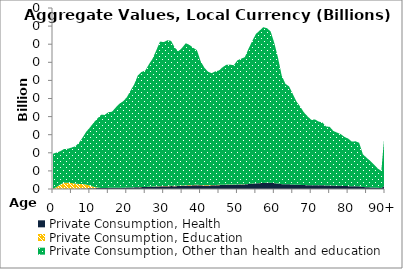
| Category | Private Consumption, Health | Private Consumption, Education | Private Consumption, Other than health and education |
|---|---|---|---|
| 0 | 0.013 | 0 | 3.884 |
|  | 0.017 | 0.215 | 3.801 |
| 2 | 0.019 | 0.484 | 3.68 |
| 3 | 0.022 | 0.674 | 3.724 |
| 4 | 0.024 | 0.67 | 3.746 |
| 5 | 0.028 | 0.629 | 3.917 |
| 6 | 0.033 | 0.568 | 4.117 |
| 7 | 0.041 | 0.52 | 4.518 |
| 8 | 0.051 | 0.506 | 5.117 |
| 9 | 0.064 | 0.427 | 5.83 |
| 10 | 0.075 | 0.305 | 6.408 |
| 11 | 0.088 | 0.153 | 7.078 |
| 12 | 0.1 | 0.065 | 7.606 |
| 13 | 0.112 | 0.003 | 8.084 |
| 14 | 0.116 | 0.001 | 8.07 |
| 15 | 0.123 | 0.002 | 8.356 |
| 16 | 0.126 | 0 | 8.415 |
| 17 | 0.134 | 0 | 8.868 |
| 18 | 0.141 | 0 | 9.277 |
| 19 | 0.146 | 0.001 | 9.542 |
| 20 | 0.153 | 0.002 | 9.97 |
| 21 | 0.166 | 0.003 | 10.688 |
| 22 | 0.179 | 0.005 | 11.363 |
| 23 | 0.197 | 0.007 | 12.351 |
| 24 | 0.207 | 0.009 | 12.719 |
| 25 | 0.213 | 0.011 | 12.854 |
| 26 | 0.23 | 0.014 | 13.53 |
| 27 | 0.246 | 0.018 | 14.136 |
| 28 | 0.268 | 0.022 | 15.039 |
| 29 | 0.291 | 0.026 | 15.972 |
| 30 | 0.297 | 0.029 | 15.905 |
| 31 | 0.31 | 0.032 | 16.09 |
| 32 | 0.319 | 0.035 | 16.023 |
| 33 | 0.315 | 0.036 | 15.281 |
| 34 | 0.319 | 0.037 | 14.86 |
| 35 | 0.343 | 0.041 | 15.226 |
| 36 | 0.374 | 0.044 | 15.688 |
| 37 | 0.391 | 0.046 | 15.486 |
| 38 | 0.406 | 0.046 | 15.152 |
| 39 | 0.42 | 0.047 | 14.881 |
| 40 | 0.403 | 0.043 | 13.694 |
| 41 | 0.397 | 0.041 | 12.988 |
| 42 | 0.396 | 0.038 | 12.534 |
| 43 | 0.401 | 0.037 | 12.363 |
| 44 | 0.415 | 0.035 | 12.544 |
| 45 | 0.425 | 0.033 | 12.642 |
| 46 | 0.442 | 0.032 | 12.99 |
| 47 | 0.456 | 0.03 | 13.241 |
| 48 | 0.461 | 0.027 | 13.256 |
| 49 | 0.464 | 0.023 | 13.184 |
| 50 | 0.488 | 0.021 | 13.712 |
| 51 | 0.499 | 0.018 | 13.878 |
| 52 | 0.509 | 0.015 | 14.041 |
| 53 | 0.547 | 0.013 | 14.932 |
| 54 | 0.584 | 0.012 | 15.752 |
| 55 | 0.62 | 0.01 | 16.498 |
| 56 | 0.643 | 0.008 | 16.85 |
| 57 | 0.667 | 0.006 | 17.202 |
| 58 | 0.677 | 0.005 | 17.088 |
| 59 | 0.68 | 0.004 | 16.728 |
| 60 | 0.647 | 0.003 | 15.474 |
| 61 | 0.599 | 0.003 | 13.89 |
| 62 | 0.535 | 0.003 | 11.997 |
| 63 | 0.512 | 0.002 | 11.109 |
| 64 | 0.516 | 0.003 | 10.819 |
| 65 | 0.494 | 0.003 | 10.009 |
| 66 | 0.469 | 0.003 | 9.201 |
| 67 | 0.455 | 0.003 | 8.651 |
| 68 | 0.434 | 0.003 | 8.041 |
| 69 | 0.421 | 0.003 | 7.607 |
| 70 | 0.41 | 0.003 | 7.223 |
| 71 | 0.421 | 0.003 | 7.267 |
| 72 | 0.414 | 0.003 | 7.035 |
| 73 | 0.413 | 0.003 | 6.953 |
| 74 | 0.392 | 0.003 | 6.515 |
| 75 | 0.393 | 0.003 | 6.476 |
| 76 | 0.37 | 0.003 | 6.037 |
| 77 | 0.362 | 0.003 | 5.868 |
| 78 | 0.351 | 0.003 | 5.712 |
| 79 | 0.328 | 0.003 | 5.428 |
| 80 | 0.317 | 0.003 | 5.255 |
| 81 | 0.298 | 0.002 | 4.944 |
| 82 | 0.3 | 0.002 | 4.966 |
| 83 | 0.291 | 0.002 | 4.816 |
| 84 | 0.219 | 0.002 | 3.627 |
| 85 | 0.196 | 0.002 | 3.254 |
| 86 | 0.177 | 0.001 | 2.935 |
| 87 | 0.153 | 0.001 | 2.538 |
| 88 | 0.13 | 0.001 | 2.148 |
| 89 | 0.114 | 0.001 | 1.884 |
| 90+ | 0.382 | 0.003 | 6.325 |